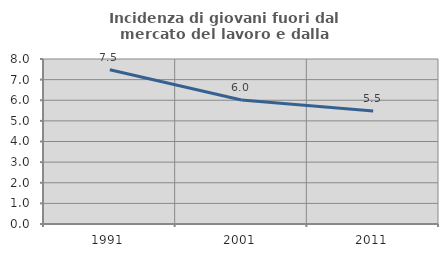
| Category | Incidenza di giovani fuori dal mercato del lavoro e dalla formazione  |
|---|---|
| 1991.0 | 7.479 |
| 2001.0 | 6.009 |
| 2011.0 | 5.479 |